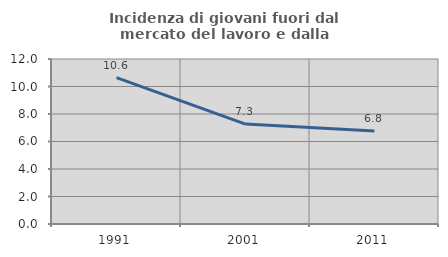
| Category | Incidenza di giovani fuori dal mercato del lavoro e dalla formazione  |
|---|---|
| 1991.0 | 10.649 |
| 2001.0 | 7.266 |
| 2011.0 | 6.767 |